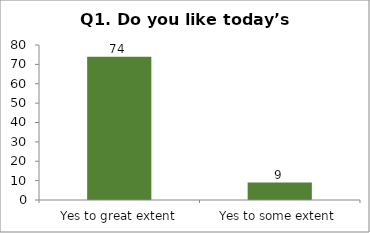
| Category | Q1. Do you like today’s session? |
|---|---|
| Yes to great extent | 74 |
| Yes to some extent | 9 |